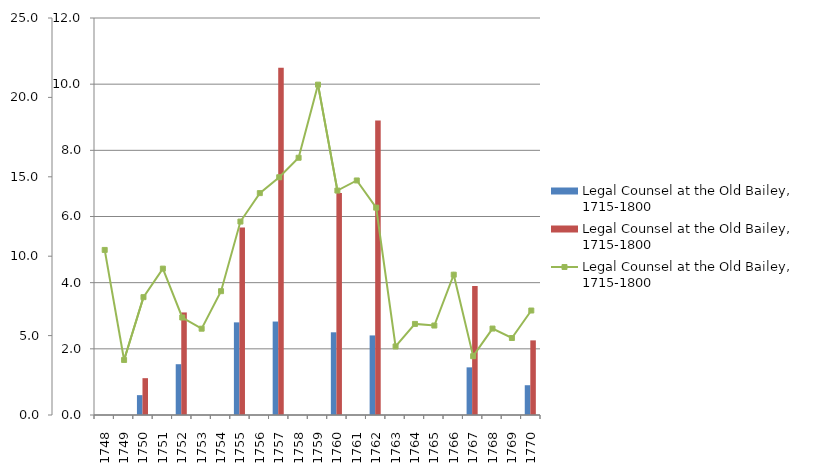
| Category | Legal Counsel at the Old Bailey, 1715-1800 |
|---|---|
| 1748 | 0 |
| 1749 | 0 |
| 1750 | 1.113 |
| 1751 | 0 |
| 1752 | 3.1 |
| 1753 | 0 |
| 1754 | 0 |
| 1755 | 5.666 |
| 1756 | 0 |
| 1757 | 10.5 |
| 1758 | 0 |
| 1759 | 0 |
| 1760 | 6.714 |
| 1761 | 0 |
| 1762 | 8.9 |
| 1763 | 0 |
| 1764 | 0 |
| 1765 | 0 |
| 1766 | 0 |
| 1767 | 3.9 |
| 1768 | 0 |
| 1769 | 0 |
| 1770 | 2.256 |